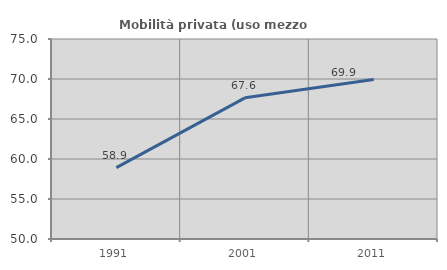
| Category | Mobilità privata (uso mezzo privato) |
|---|---|
| 1991.0 | 58.924 |
| 2001.0 | 67.647 |
| 2011.0 | 69.944 |